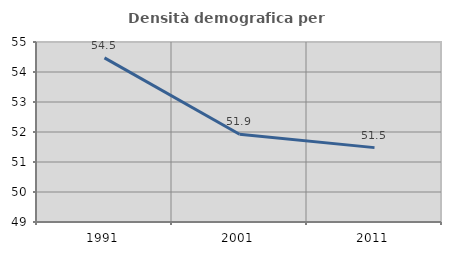
| Category | Densità demografica |
|---|---|
| 1991.0 | 54.471 |
| 2001.0 | 51.926 |
| 2011.0 | 51.479 |